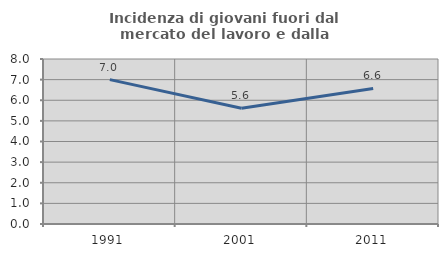
| Category | Incidenza di giovani fuori dal mercato del lavoro e dalla formazione  |
|---|---|
| 1991.0 | 7.001 |
| 2001.0 | 5.612 |
| 2011.0 | 6.574 |